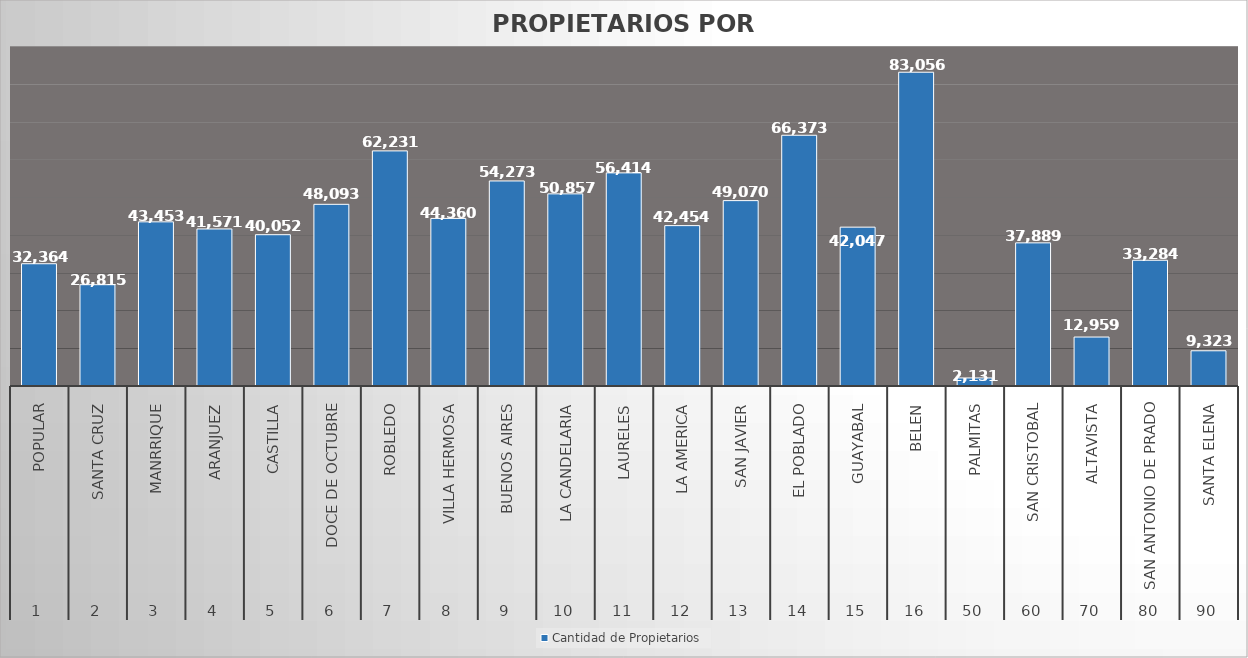
| Category | Cantidad de Propietarios |
|---|---|
| 0 | 32364 |
| 1 | 26815 |
| 2 | 43453 |
| 3 | 41571 |
| 4 | 40052 |
| 5 | 48093 |
| 6 | 62231 |
| 7 | 44360 |
| 8 | 54273 |
| 9 | 50857 |
| 10 | 56414 |
| 11 | 42454 |
| 12 | 49070 |
| 13 | 66373 |
| 14 | 42047 |
| 15 | 83056 |
| 16 | 2131 |
| 17 | 37889 |
| 18 | 12959 |
| 19 | 33284 |
| 20 | 9323 |